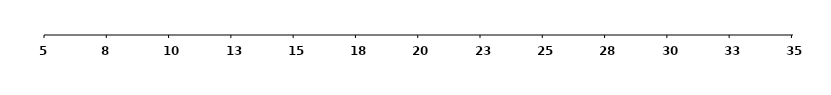
| Category | Series 0 |
|---|---|
| 5.0 | 0.004 |
| 5.0625 | 0.005 |
| 5.125 | 0.005 |
| 5.1875 | 0.005 |
| 5.25 | 0.005 |
| 5.3125 | 0.005 |
| 5.375 | 0.006 |
| 5.4375 | 0.006 |
| 5.5 | 0.006 |
| 5.5625 | 0.006 |
| 5.625 | 0.006 |
| 5.6875 | 0.007 |
| 5.75 | 0.007 |
| 5.8125 | 0.007 |
| 5.875 | 0.007 |
| 5.9375 | 0.008 |
| 6.0 | 0.008 |
| 6.0625 | 0.008 |
| 6.125 | 0.008 |
| 6.1875 | 0.009 |
| 6.25 | 0.009 |
| 6.3125 | 0.009 |
| 6.375 | 0.01 |
| 6.4375 | 0.01 |
| 6.5 | 0.01 |
| 6.5625 | 0.011 |
| 6.625 | 0.011 |
| 6.6875 | 0.012 |
| 6.75 | 0.012 |
| 6.8125 | 0.012 |
| 6.875 | 0.013 |
| 6.9375 | 0.013 |
| 7.0 | 0.014 |
| 7.0625 | 0.014 |
| 7.125 | 0.014 |
| 7.1875 | 0.015 |
| 7.25 | 0.015 |
| 7.3125 | 0.016 |
| 7.375 | 0.016 |
| 7.4375 | 0.017 |
| 7.5 | 0.018 |
| 7.5625 | 0.018 |
| 7.625 | 0.019 |
| 7.6875 | 0.019 |
| 7.75 | 0.02 |
| 7.8125 | 0.02 |
| 7.875 | 0.021 |
| 7.9375 | 0.022 |
| 8.0 | 0.022 |
| 8.0625 | 0.023 |
| 8.125 | 0.024 |
| 8.1875 | 0.024 |
| 8.25 | 0.025 |
| 8.3125 | 0.026 |
| 8.375 | 0.027 |
| 8.4375 | 0.028 |
| 8.5 | 0.028 |
| 8.5625 | 0.029 |
| 8.625 | 0.03 |
| 8.6875 | 0.031 |
| 8.75 | 0.032 |
| 8.8125 | 0.033 |
| 8.875 | 0.034 |
| 8.9375 | 0.035 |
| 9.0 | 0.035 |
| 9.0625 | 0.036 |
| 9.125 | 0.037 |
| 9.1875 | 0.038 |
| 9.25 | 0.04 |
| 9.3125 | 0.041 |
| 9.375 | 0.042 |
| 9.4375 | 0.043 |
| 9.5 | 0.044 |
| 9.5625 | 0.045 |
| 9.625 | 0.046 |
| 9.6875 | 0.048 |
| 9.75 | 0.049 |
| 9.8125 | 0.05 |
| 9.875 | 0.051 |
| 9.9375 | 0.053 |
| 10.0 | 0.054 |
| 10.0625 | 0.055 |
| 10.125 | 0.057 |
| 10.1875 | 0.058 |
| 10.25 | 0.06 |
| 10.3125 | 0.061 |
| 10.375 | 0.063 |
| 10.4375 | 0.064 |
| 10.5 | 0.066 |
| 10.5625 | 0.067 |
| 10.625 | 0.069 |
| 10.6875 | 0.07 |
| 10.75 | 0.072 |
| 10.8125 | 0.074 |
| 10.875 | 0.075 |
| 10.9375 | 0.077 |
| 11.0 | 0.079 |
| 11.0625 | 0.081 |
| 11.125 | 0.083 |
| 11.1875 | 0.084 |
| 11.25 | 0.086 |
| 11.3125 | 0.088 |
| 11.375 | 0.09 |
| 11.4375 | 0.092 |
| 11.5 | 0.094 |
| 11.5625 | 0.096 |
| 11.625 | 0.098 |
| 11.6875 | 0.1 |
| 11.75 | 0.102 |
| 11.8125 | 0.104 |
| 11.875 | 0.107 |
| 11.9375 | 0.109 |
| 12.0 | 0.111 |
| 12.0625 | 0.113 |
| 12.125 | 0.115 |
| 12.1875 | 0.118 |
| 12.25 | 0.12 |
| 12.3125 | 0.122 |
| 12.375 | 0.125 |
| 12.4375 | 0.127 |
| 12.5 | 0.13 |
| 12.5625 | 0.132 |
| 12.625 | 0.134 |
| 12.6875 | 0.137 |
| 12.75 | 0.139 |
| 12.8125 | 0.142 |
| 12.875 | 0.145 |
| 12.9375 | 0.147 |
| 13.0 | 0.15 |
| 13.0625 | 0.152 |
| 13.125 | 0.155 |
| 13.1875 | 0.158 |
| 13.25 | 0.16 |
| 13.3125 | 0.163 |
| 13.375 | 0.166 |
| 13.4375 | 0.169 |
| 13.5 | 0.171 |
| 13.5625 | 0.174 |
| 13.625 | 0.177 |
| 13.6875 | 0.18 |
| 13.75 | 0.183 |
| 13.8125 | 0.186 |
| 13.875 | 0.188 |
| 13.9375 | 0.191 |
| 14.0 | 0.194 |
| 14.0625 | 0.197 |
| 14.125 | 0.2 |
| 14.1875 | 0.203 |
| 14.25 | 0.206 |
| 14.3125 | 0.209 |
| 14.375 | 0.212 |
| 14.4375 | 0.215 |
| 14.5 | 0.218 |
| 14.5625 | 0.221 |
| 14.625 | 0.224 |
| 14.6875 | 0.227 |
| 14.75 | 0.23 |
| 14.8125 | 0.233 |
| 14.875 | 0.236 |
| 14.9375 | 0.239 |
| 15.0 | 0.242 |
| 15.0625 | 0.245 |
| 15.125 | 0.248 |
| 15.1875 | 0.251 |
| 15.25 | 0.254 |
| 15.3125 | 0.257 |
| 15.375 | 0.26 |
| 15.4375 | 0.263 |
| 15.5 | 0.266 |
| 15.5625 | 0.269 |
| 15.625 | 0.272 |
| 15.6875 | 0.275 |
| 15.75 | 0.278 |
| 15.8125 | 0.281 |
| 15.875 | 0.284 |
| 15.9375 | 0.287 |
| 16.0 | 0.29 |
| 16.0625 | 0.293 |
| 16.125 | 0.295 |
| 16.1875 | 0.298 |
| 16.25 | 0.301 |
| 16.3125 | 0.304 |
| 16.375 | 0.307 |
| 16.4375 | 0.31 |
| 16.5 | 0.312 |
| 16.5625 | 0.315 |
| 16.625 | 0.318 |
| 16.6875 | 0.32 |
| 16.75 | 0.323 |
| 16.8125 | 0.326 |
| 16.875 | 0.328 |
| 16.9375 | 0.331 |
| 17.0 | 0.333 |
| 17.0625 | 0.336 |
| 17.125 | 0.338 |
| 17.1875 | 0.341 |
| 17.25 | 0.343 |
| 17.3125 | 0.345 |
| 17.375 | 0.348 |
| 17.4375 | 0.35 |
| 17.5 | 0.352 |
| 17.5625 | 0.354 |
| 17.625 | 0.356 |
| 17.6875 | 0.358 |
| 17.75 | 0.361 |
| 17.8125 | 0.363 |
| 17.875 | 0.364 |
| 17.9375 | 0.366 |
| 18.0 | 0.368 |
| 18.0625 | 0.37 |
| 18.125 | 0.372 |
| 18.1875 | 0.374 |
| 18.25 | 0.375 |
| 18.3125 | 0.377 |
| 18.375 | 0.378 |
| 18.4375 | 0.38 |
| 18.5 | 0.381 |
| 18.5625 | 0.383 |
| 18.625 | 0.384 |
| 18.6875 | 0.385 |
| 18.75 | 0.387 |
| 18.8125 | 0.388 |
| 18.875 | 0.389 |
| 18.9375 | 0.39 |
| 19.0 | 0.391 |
| 19.0625 | 0.392 |
| 19.125 | 0.393 |
| 19.1875 | 0.394 |
| 19.25 | 0.394 |
| 19.3125 | 0.395 |
| 19.375 | 0.396 |
| 19.4375 | 0.396 |
| 19.5 | 0.397 |
| 19.5625 | 0.397 |
| 19.625 | 0.398 |
| 19.6875 | 0.398 |
| 19.75 | 0.398 |
| 19.8125 | 0.399 |
| 19.875 | 0.399 |
| 19.9375 | 0.399 |
| 20.0 | 0.399 |
| 20.0625 | 0.399 |
| 20.125 | 0.399 |
| 20.1875 | 0.399 |
| 20.25 | 0.398 |
| 20.3125 | 0.398 |
| 20.375 | 0.398 |
| 20.4375 | 0.397 |
| 20.5 | 0.397 |
| 20.5625 | 0.396 |
| 20.625 | 0.396 |
| 20.6875 | 0.395 |
| 20.75 | 0.394 |
| 20.8125 | 0.394 |
| 20.875 | 0.393 |
| 20.9375 | 0.392 |
| 21.0 | 0.391 |
| 21.0625 | 0.39 |
| 21.125 | 0.389 |
| 21.1875 | 0.388 |
| 21.25 | 0.387 |
| 21.3125 | 0.385 |
| 21.375 | 0.384 |
| 21.4375 | 0.383 |
| 21.5 | 0.381 |
| 21.5625 | 0.38 |
| 21.625 | 0.378 |
| 21.6875 | 0.377 |
| 21.75 | 0.375 |
| 21.8125 | 0.374 |
| 21.875 | 0.372 |
| 21.9375 | 0.37 |
| 22.0 | 0.368 |
| 22.0625 | 0.366 |
| 22.125 | 0.364 |
| 22.1875 | 0.363 |
| 22.25 | 0.361 |
| 22.3125 | 0.358 |
| 22.375 | 0.356 |
| 22.4375 | 0.354 |
| 22.5 | 0.352 |
| 22.5625 | 0.35 |
| 22.625 | 0.348 |
| 22.6875 | 0.345 |
| 22.75 | 0.343 |
| 22.8125 | 0.341 |
| 22.875 | 0.338 |
| 22.9375 | 0.336 |
| 23.0 | 0.333 |
| 23.0625 | 0.331 |
| 23.125 | 0.328 |
| 23.1875 | 0.326 |
| 23.25 | 0.323 |
| 23.3125 | 0.32 |
| 23.375 | 0.318 |
| 23.4375 | 0.315 |
| 23.5 | 0.312 |
| 23.5625 | 0.31 |
| 23.625 | 0.307 |
| 23.6875 | 0.304 |
| 23.75 | 0.301 |
| 23.8125 | 0.298 |
| 23.875 | 0.295 |
| 23.9375 | 0.293 |
| 24.0 | 0.29 |
| 24.0625 | 0.287 |
| 24.125 | 0.284 |
| 24.1875 | 0.281 |
| 24.25 | 0.278 |
| 24.3125 | 0.275 |
| 24.375 | 0.272 |
| 24.4375 | 0.269 |
| 24.5 | 0.266 |
| 24.5625 | 0.263 |
| 24.625 | 0.26 |
| 24.6875 | 0.257 |
| 24.75 | 0.254 |
| 24.8125 | 0.251 |
| 24.875 | 0.248 |
| 24.9375 | 0.245 |
| 25.0 | 0.242 |
| 25.0625 | 0.239 |
| 25.125 | 0.236 |
| 25.1875 | 0.233 |
| 25.25 | 0.23 |
| 25.3125 | 0.227 |
| 25.375 | 0.224 |
| 25.4375 | 0.221 |
| 25.5 | 0.218 |
| 25.5625 | 0.215 |
| 25.625 | 0.212 |
| 25.6875 | 0.209 |
| 25.75 | 0.206 |
| 25.8125 | 0.203 |
| 25.875 | 0.2 |
| 25.9375 | 0.197 |
| 26.0 | 0.194 |
| 26.0625 | 0.191 |
| 26.125 | 0.188 |
| 26.1875 | 0.186 |
| 26.25 | 0.183 |
| 26.3125 | 0.18 |
| 26.375 | 0.177 |
| 26.4375 | 0.174 |
| 26.5 | 0.171 |
| 26.5625 | 0.169 |
| 26.625 | 0.166 |
| 26.6875 | 0.163 |
| 26.75 | 0.16 |
| 26.8125 | 0.158 |
| 26.875 | 0.155 |
| 26.9375 | 0.152 |
| 27.0 | 0.15 |
| 27.0625 | 0.147 |
| 27.125 | 0.145 |
| 27.1875 | 0.142 |
| 27.25 | 0.139 |
| 27.3125 | 0.137 |
| 27.375 | 0.134 |
| 27.4375 | 0.132 |
| 27.5 | 0.13 |
| 27.5625 | 0.127 |
| 27.625 | 0.125 |
| 27.6875 | 0.122 |
| 27.75 | 0.12 |
| 27.8125 | 0.118 |
| 27.875 | 0.115 |
| 27.9375 | 0.113 |
| 28.0 | 0.111 |
| 28.0625 | 0.109 |
| 28.125 | 0.107 |
| 28.1875 | 0.104 |
| 28.25 | 0.102 |
| 28.3125 | 0.1 |
| 28.375 | 0.098 |
| 28.4375 | 0.096 |
| 28.5 | 0.094 |
| 28.5625 | 0.092 |
| 28.625 | 0.09 |
| 28.6875 | 0.088 |
| 28.75 | 0.086 |
| 28.8125 | 0.084 |
| 28.875 | 0.083 |
| 28.9375 | 0.081 |
| 29.0 | 0.079 |
| 29.0625 | 0.077 |
| 29.125 | 0.075 |
| 29.1875 | 0.074 |
| 29.25 | 0.072 |
| 29.3125 | 0.07 |
| 29.375 | 0.069 |
| 29.4375 | 0.067 |
| 29.5 | 0.066 |
| 29.5625 | 0.064 |
| 29.625 | 0.063 |
| 29.6875 | 0.061 |
| 29.75 | 0.06 |
| 29.8125 | 0.058 |
| 29.875 | 0.057 |
| 29.9375 | 0.055 |
| 30.0 | 0.054 |
| 30.0625 | 0.053 |
| 30.125 | 0.051 |
| 30.1875 | 0.05 |
| 30.25 | 0.049 |
| 30.3125 | 0.048 |
| 30.375 | 0.046 |
| 30.4375 | 0.045 |
| 30.5 | 0.044 |
| 30.5625 | 0.043 |
| 30.625 | 0.042 |
| 30.6875 | 0.041 |
| 30.75 | 0.04 |
| 30.8125 | 0.038 |
| 30.875 | 0.037 |
| 30.9375 | 0.036 |
| 31.0 | 0.035 |
| 31.0625 | 0.035 |
| 31.125 | 0.034 |
| 31.1875 | 0.033 |
| 31.25 | 0.032 |
| 31.3125 | 0.031 |
| 31.375 | 0.03 |
| 31.4375 | 0.029 |
| 31.5 | 0.028 |
| 31.5625 | 0.028 |
| 31.625 | 0.027 |
| 31.6875 | 0.026 |
| 31.75 | 0.025 |
| 31.8125 | 0.024 |
| 31.875 | 0.024 |
| 31.9375 | 0.023 |
| 32.0 | 0.022 |
| 32.0625 | 0.022 |
| 32.125 | 0.021 |
| 32.1875 | 0.02 |
| 32.25 | 0.02 |
| 32.3125 | 0.019 |
| 32.375 | 0.019 |
| 32.4375 | 0.018 |
| 32.5 | 0.018 |
| 32.5625 | 0.017 |
| 32.625 | 0.016 |
| 32.6875 | 0.016 |
| 32.75 | 0.015 |
| 32.8125 | 0.015 |
| 32.875 | 0.014 |
| 32.9375 | 0.014 |
| 33.0 | 0.014 |
| 33.0625 | 0.013 |
| 33.125 | 0.013 |
| 33.1875 | 0.012 |
| 33.25 | 0.012 |
| 33.3125 | 0.012 |
| 33.375 | 0.011 |
| 33.4375 | 0.011 |
| 33.5 | 0.01 |
| 33.5625 | 0.01 |
| 33.625 | 0.01 |
| 33.6875 | 0.009 |
| 33.75 | 0.009 |
| 33.8125 | 0.009 |
| 33.875 | 0.008 |
| 33.9375 | 0.008 |
| 34.0 | 0.008 |
| 34.0625 | 0.008 |
| 34.125 | 0.007 |
| 34.1875 | 0.007 |
| 34.25 | 0.007 |
| 34.3125 | 0.007 |
| 34.375 | 0.006 |
| 34.4375 | 0.006 |
| 34.5 | 0.006 |
| 34.5625 | 0.006 |
| 34.625 | 0.006 |
| 34.6875 | 0.005 |
| 34.75 | 0.005 |
| 34.8125 | 0.005 |
| 34.875 | 0.005 |
| 34.9375 | 0.005 |
| 35.0 | 0.004 |